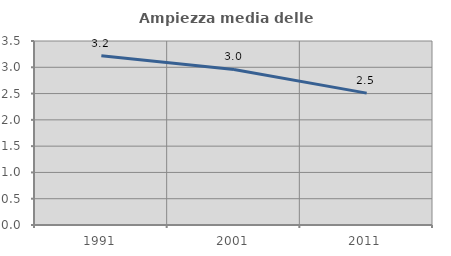
| Category | Ampiezza media delle famiglie |
|---|---|
| 1991.0 | 3.222 |
| 2001.0 | 2.959 |
| 2011.0 | 2.509 |